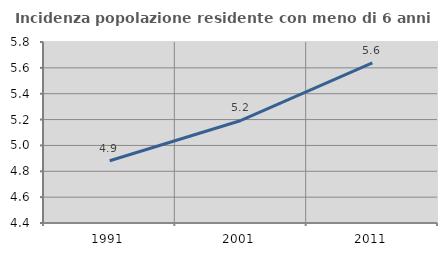
| Category | Incidenza popolazione residente con meno di 6 anni |
|---|---|
| 1991.0 | 4.882 |
| 2001.0 | 5.193 |
| 2011.0 | 5.639 |